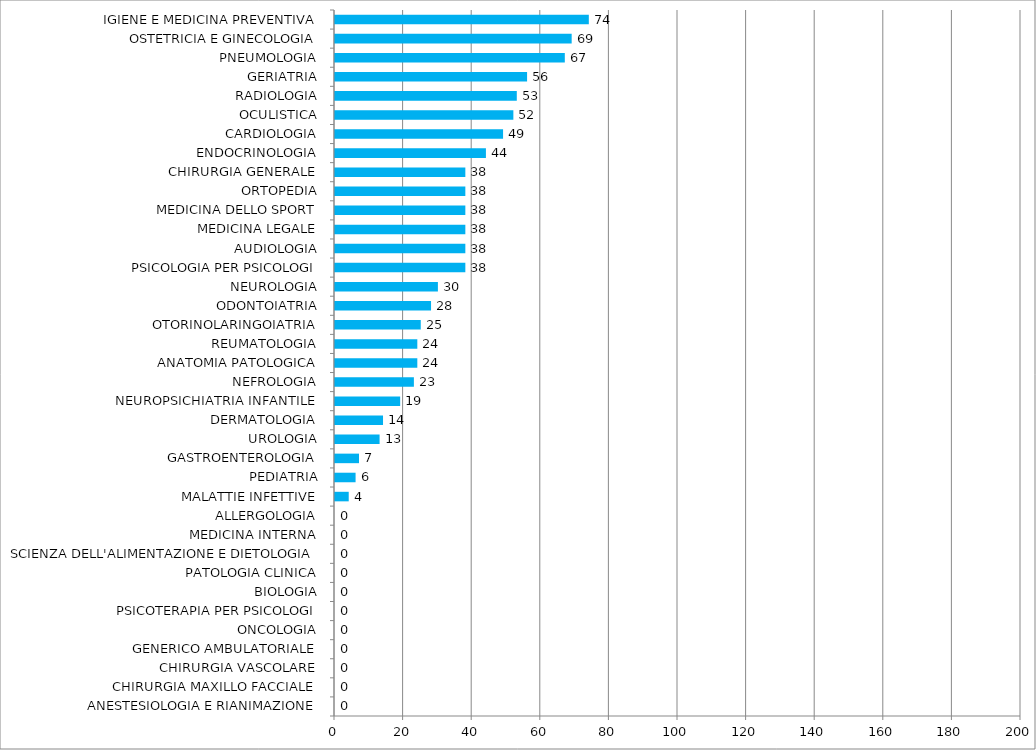
| Category | Series 0 |
|---|---|
| ANESTESIOLOGIA E RIANIMAZIONE | 0 |
| CHIRURGIA MAXILLO FACCIALE | 0 |
| CHIRURGIA VASCOLARE | 0 |
| GENERICO AMBULATORIALE | 0 |
| ONCOLOGIA | 0 |
| PSICOTERAPIA PER PSICOLOGI | 0 |
| BIOLOGIA | 0 |
| PATOLOGIA CLINICA | 0 |
| SCIENZA DELL'ALIMENTAZIONE E DIETOLOGIA | 0 |
| MEDICINA INTERNA | 0 |
| ALLERGOLOGIA | 0 |
| MALATTIE INFETTIVE | 4 |
| PEDIATRIA | 6 |
| GASTROENTEROLOGIA | 7 |
| UROLOGIA | 13 |
| DERMATOLOGIA | 14 |
| NEUROPSICHIATRIA INFANTILE | 19 |
| NEFROLOGIA | 23 |
| ANATOMIA PATOLOGICA | 24 |
| REUMATOLOGIA | 24 |
| OTORINOLARINGOIATRIA | 25 |
| ODONTOIATRIA | 28 |
| NEUROLOGIA | 30 |
| PSICOLOGIA PER PSICOLOGI | 38 |
| AUDIOLOGIA | 38 |
| MEDICINA LEGALE | 38 |
| MEDICINA DELLO SPORT | 38 |
| ORTOPEDIA | 38 |
| CHIRURGIA GENERALE | 38 |
| ENDOCRINOLOGIA | 44 |
| CARDIOLOGIA | 49 |
| OCULISTICA | 52 |
| RADIOLOGIA | 53 |
| GERIATRIA | 56 |
| PNEUMOLOGIA | 67 |
| OSTETRICIA E GINECOLOGIA | 69 |
| IGIENE E MEDICINA PREVENTIVA | 74 |